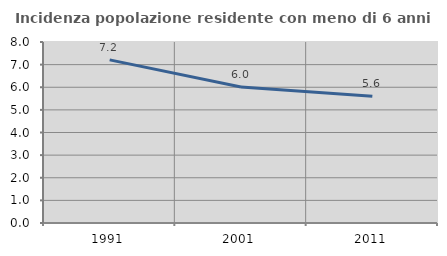
| Category | Incidenza popolazione residente con meno di 6 anni |
|---|---|
| 1991.0 | 7.211 |
| 2001.0 | 6.012 |
| 2011.0 | 5.607 |